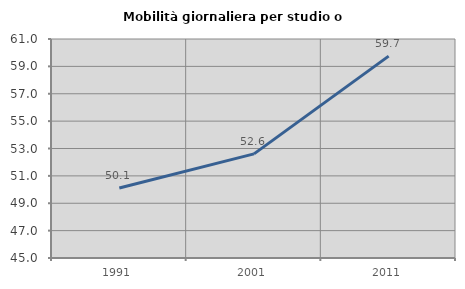
| Category | Mobilità giornaliera per studio o lavoro |
|---|---|
| 1991.0 | 50.119 |
| 2001.0 | 52.605 |
| 2011.0 | 59.748 |